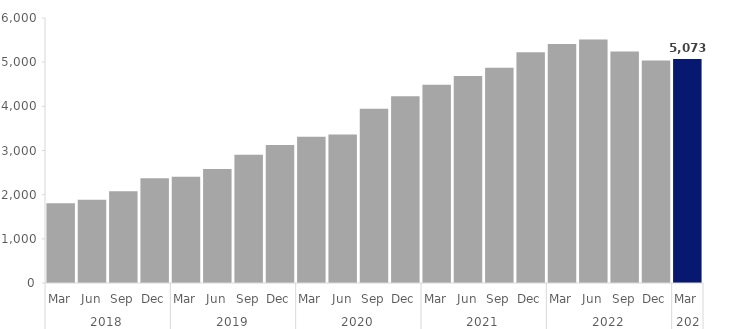
| Category | Series 0 |
|---|---|
| 0 | 1806 |
| 1 | 1887 |
| 2 | 2076 |
| 3 | 2373 |
| 4 | 2406 |
| 5 | 2580 |
| 6 | 2901 |
| 7 | 3126 |
| 8 | 3312 |
| 9 | 3360 |
| 10 | 3948 |
| 11 | 4227 |
| 12 | 4488 |
| 13 | 4686 |
| 14 | 4875 |
| 15 | 5223 |
| 16 | 5409 |
| 17 | 5511 |
| 18 | 5241 |
| 19 | 5037 |
| 20 | 5073 |